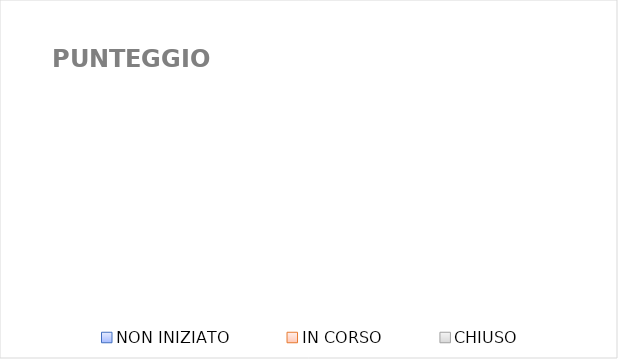
| Category | Series 0 |
|---|---|
| NON INIZIATO | 0 |
| IN CORSO | 0 |
| CHIUSO | 0 |